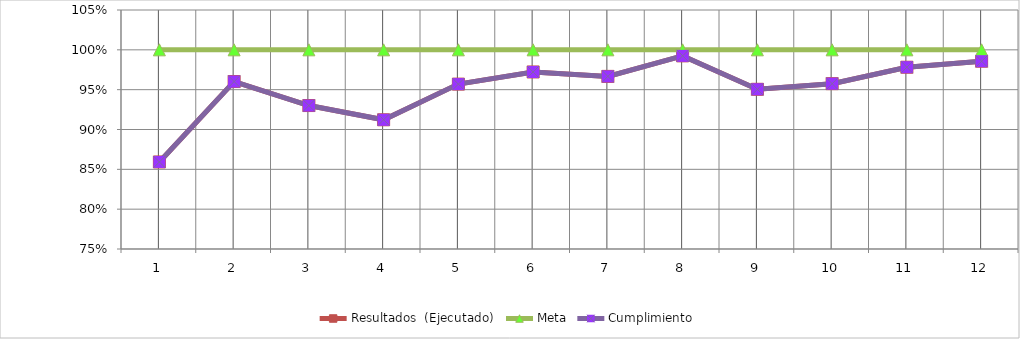
| Category | Resultados  (Ejecutado) | Meta | Cumplimiento |
|---|---|---|---|
| 0 | 0.859 | 1 | 0.859 |
| 1 | 0.96 | 1 | 0.96 |
| 2 | 0.93 | 1 | 0.93 |
| 3 | 0.912 | 1 | 0.912 |
| 4 | 0.957 | 1 | 0.957 |
| 5 | 0.972 | 1 | 0.972 |
| 6 | 0.967 | 1 | 0.967 |
| 7 | 0.992 | 1 | 0.992 |
| 8 | 0.95 | 1 | 0.95 |
| 9 | 0.958 | 1 | 0.958 |
| 10 | 0.978 | 1 | 0.978 |
| 11 | 0.986 | 1 | 0.986 |